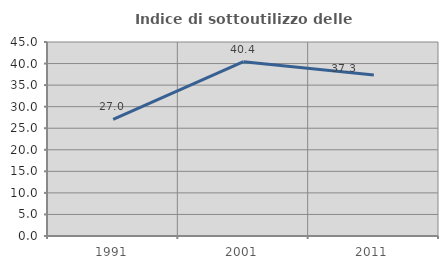
| Category | Indice di sottoutilizzo delle abitazioni  |
|---|---|
| 1991.0 | 27.027 |
| 2001.0 | 40.426 |
| 2011.0 | 37.324 |